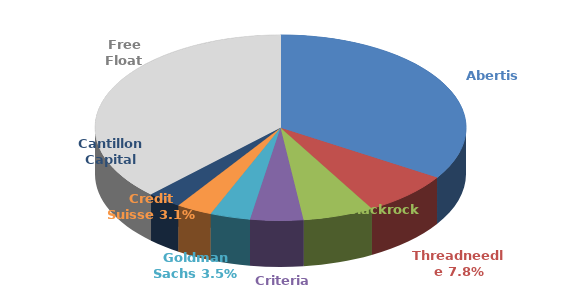
| Category | Series 0 |
|---|---|
| Abertis | 0.34 |
| Threadneedle | 0.078 |
| Blackrock | 0.062 |
| Criteria | 0.046 |
| Goldman Sachs | 0.035 |
| Credit Suisse | 0.031 |
| Cantillon Capital | 0.03 |
| Free Float | 0.377 |